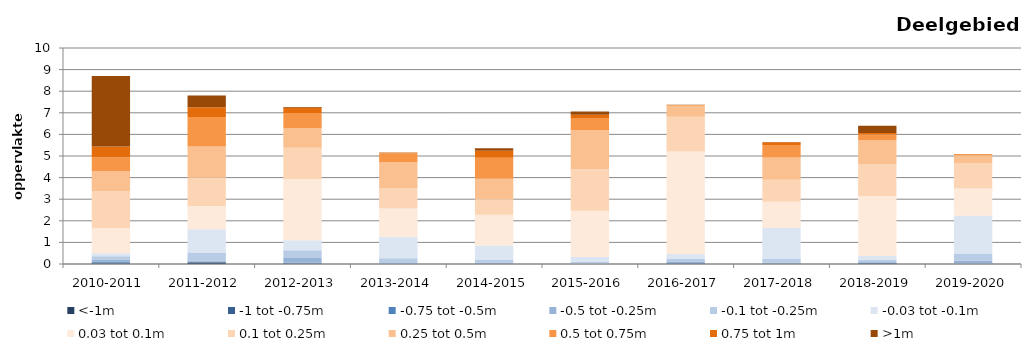
| Category | <-1m | -1 tot -0.75m | -0.75 tot -0.5m | -0.5 tot -0.25m | -0.1 tot -0.25m | -0.03 tot -0.1m | 0.03 tot 0.1m | 0.1 tot 0.25m | 0.25 tot 0.5m | 0.5 tot 0.75m | 0.75 tot 1m | >1m |
|---|---|---|---|---|---|---|---|---|---|---|---|---|
| 2010-2011 | 0.023 | 0.043 | 0.047 | 0.093 | 0.157 | 0.133 | 1.164 | 1.716 | 0.918 | 0.649 | 0.501 | 3.256 |
| 2011-2012 | 0.066 | 0.017 | 0.026 | 0.054 | 0.367 | 1.076 | 1.08 | 1.324 | 1.428 | 1.372 | 0.448 | 0.547 |
| 2012-2013 | 0.015 | 0.011 | 0.036 | 0.221 | 0.358 | 0.454 | 2.838 | 1.454 | 0.91 | 0.691 | 0.246 | 0.034 |
| 2013-2014 | 0 | 0 | 0 | 0.044 | 0.217 | 0.997 | 1.316 | 0.941 | 1.194 | 0.421 | 0.02 | 0.007 |
| 2014-2015 | 0.003 | 0.006 | 0.009 | 0.052 | 0.14 | 0.647 | 1.424 | 0.71 | 0.953 | 0.975 | 0.323 | 0.117 |
| 2015-2016 | 0 | 0 | 0 | 0.016 | 0.078 | 0.234 | 2.138 | 1.919 | 1.807 | 0.566 | 0.153 | 0.152 |
| 2016-2017 | 0.014 | 0.013 | 0.015 | 0.05 | 0.138 | 0.229 | 4.752 | 1.609 | 0.503 | 0.037 | 0.005 | 0.002 |
| 2017-2018 | 0.006 | 0.008 | 0.014 | 0.044 | 0.184 | 1.415 | 1.216 | 1.013 | 1.032 | 0.572 | 0.132 | 0.011 |
| 2018-2019 | 0.024 | 0.016 | 0.021 | 0.03 | 0.11 | 0.168 | 2.762 | 1.486 | 1.114 | 0.272 | 0.064 | 0.328 |
| 2019-2020 | 0 | 0.001 | 0.014 | 0.142 | 0.324 | 1.749 | 1.268 | 1.157 | 0.379 | 0.055 | 0.008 | 0 |